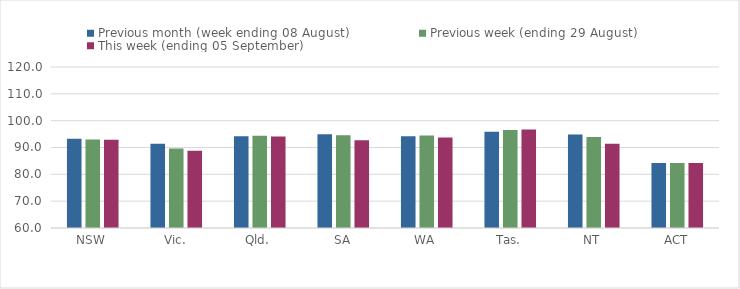
| Category | Previous month (week ending 08 August) | Previous week (ending 29 August) | This week (ending 05 September) |
|---|---|---|---|
| NSW | 93.25 | 92.98 | 92.89 |
| Vic. | 91.4 | 89.59 | 88.77 |
| Qld. | 94.21 | 94.34 | 94.09 |
| SA | 94.98 | 94.56 | 92.74 |
| WA | 94.22 | 94.47 | 93.73 |
| Tas. | 95.89 | 96.52 | 96.7 |
| NT | 94.88 | 93.9 | 91.44 |
| ACT | 84.25 | 84.25 | 84.25 |